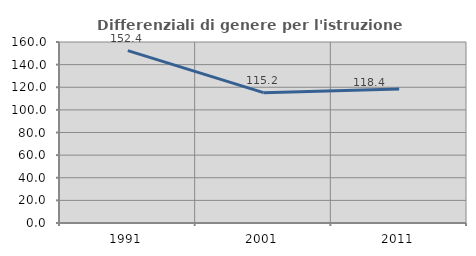
| Category | Differenziali di genere per l'istruzione superiore |
|---|---|
| 1991.0 | 152.379 |
| 2001.0 | 115.229 |
| 2011.0 | 118.39 |